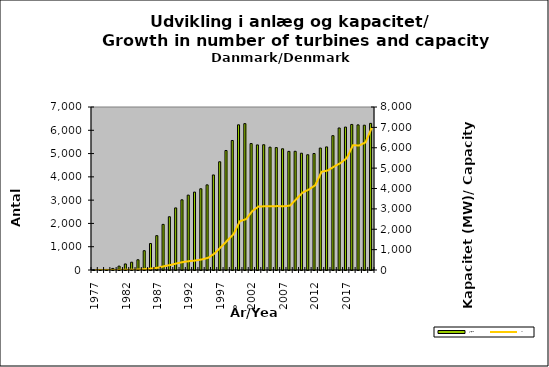
| Category | Antal/No |
|---|---|
| 1977.0 | 2 |
| 1978.0 | 13 |
| 1979.0 | 23 |
| 1980.0 | 68 |
| 1981.0 | 166 |
| 1982.0 | 260 |
| 1983.0 | 335 |
| 1984.0 | 440 |
| 1985.0 | 829 |
| 1986.0 | 1137 |
| 1987.0 | 1475 |
| 1988.0 | 1959 |
| 1989.0 | 2287 |
| 1990.0 | 2666 |
| 1991.0 | 3014 |
| 1992.0 | 3216 |
| 1993.0 | 3345 |
| 1994.0 | 3488 |
| 1995.0 | 3656 |
| 1996.0 | 4082 |
| 1997.0 | 4648 |
| 1998.0 | 5132 |
| 1999.0 | 5562 |
| 2000.0 | 6235 |
| 2001.0 | 6286 |
| 2002.0 | 5431 |
| 2003.0 | 5372 |
| 2004.0 | 5380 |
| 2005.0 | 5275 |
| 2006.0 | 5257 |
| 2007.0 | 5206 |
| 2008.0 | 5094 |
| 2009.0 | 5098 |
| 2010.0 | 5015 |
| 2011.0 | 4950 |
| 2012.0 | 5002 |
| 2013.0 | 5237 |
| 2014.0 | 5286 |
| 2015.0 | 5769 |
| 2016.0 | 6099 |
| 2017.0 | 6138 |
| 2018.0 | 6251 |
| 2019.0 | 6232 |
| 2020.0 | 6218 |
| 2021.0 | 6297 |